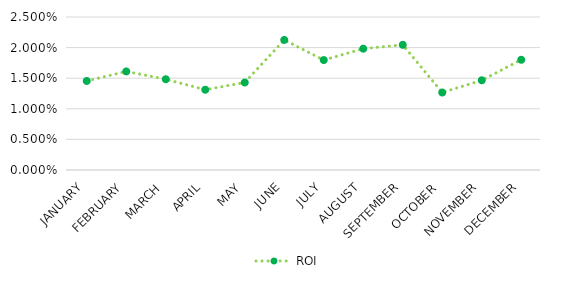
| Category | ROI |
|---|---|
| JANUARY | 0.015 |
| FEBRUARY | 0.016 |
| MARCH | 0.015 |
| APRIL | 0.013 |
| MAY | 0.014 |
| JUNE | 0.021 |
| JULY | 0.018 |
| AUGUST | 0.02 |
| SEPTEMBER | 0.02 |
| OCTOBER | 0.013 |
| NOVEMBER | 0.015 |
| DECEMBER | 0.018 |